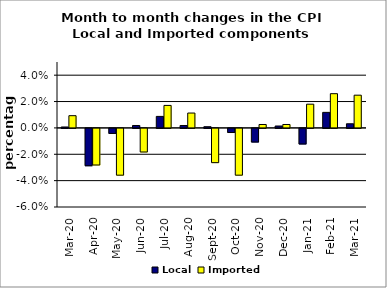
| Category | Local | Imported |
|---|---|---|
| 2020-03-01 | 0.001 | 0.009 |
| 2020-04-01 | -0.028 | -0.028 |
| 2020-05-01 | -0.004 | -0.035 |
| 2020-06-01 | 0.002 | -0.018 |
| 2020-07-01 | 0.009 | 0.017 |
| 2020-08-01 | 0.002 | 0.011 |
| 2020-09-01 | 0.001 | -0.026 |
| 2020-10-01 | -0.003 | -0.035 |
| 2020-11-01 | -0.01 | 0.003 |
| 2020-12-01 | 0.001 | 0.003 |
| 2021-01-01 | -0.012 | 0.018 |
| 2021-02-01 | 0.012 | 0.026 |
| 2021-03-01 | 0.003 | 0.025 |